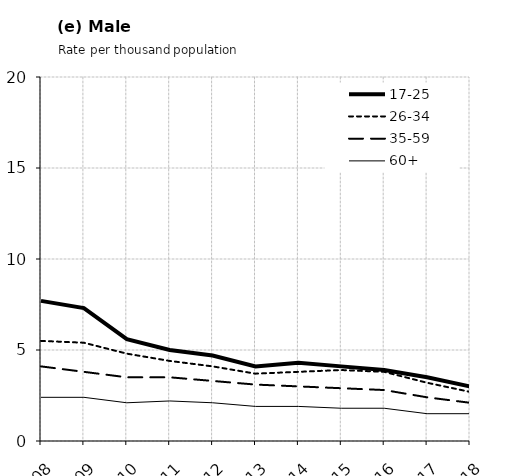
| Category | 17-25 | 26-34 | 35-59 | 60+ |
|---|---|---|---|---|
| 2008.0 | 7.7 | 5.5 | 4.1 | 2.4 |
| 2009.0 | 7.3 | 5.4 | 3.8 | 2.4 |
| 2010.0 | 5.6 | 4.8 | 3.5 | 2.1 |
| 2011.0 | 5 | 4.4 | 3.5 | 2.2 |
| 2012.0 | 4.7 | 4.1 | 3.3 | 2.1 |
| 2013.0 | 4.1 | 3.7 | 3.1 | 1.9 |
| 2014.0 | 4.3 | 3.8 | 3 | 1.9 |
| 2015.0 | 4.1 | 3.9 | 2.9 | 1.8 |
| 2016.0 | 3.9 | 3.8 | 2.8 | 1.8 |
| 2017.0 | 3.5 | 3.2 | 2.4 | 1.5 |
| 2018.0 | 3 | 2.7 | 2.1 | 1.5 |